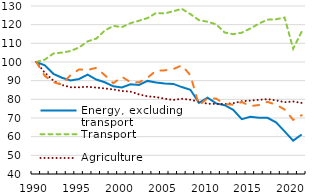
| Category | Energy, excluding transport | Transport | Agriculture | Industrial processes |
|---|---|---|---|---|
| 1990.0 | 100 | 100 | 100 | 100 |
| 1991.0 | 98.176 | 101.285 | 94.241 | 92.494 |
| 1992.0 | 93.669 | 104.553 | 89.969 | 89.17 |
| 1993.0 | 91.549 | 105.047 | 87.672 | 87.891 |
| 1994.0 | 90.108 | 105.857 | 86.494 | 93.046 |
| 1995.0 | 90.928 | 107.787 | 86.455 | 96.011 |
| 1996.0 | 93.219 | 111.061 | 86.714 | 95.743 |
| 1997.0 | 90.594 | 112.519 | 86.295 | 96.876 |
| 1998.0 | 89.133 | 116.837 | 85.851 | 92.936 |
| 1999.0 | 86.948 | 119.34 | 85.304 | 88.624 |
| 2000.0 | 86.38 | 118.707 | 84.456 | 92.082 |
| 2001.0 | 88.054 | 120.806 | 84.14 | 89.188 |
| 2002.0 | 87.666 | 122.113 | 82.646 | 89.089 |
| 2003.0 | 89.871 | 123.527 | 81.576 | 91.613 |
| 2004.0 | 89.041 | 126.264 | 81.237 | 95.404 |
| 2005.0 | 88.518 | 126.01 | 80.317 | 95.519 |
| 2006.0 | 88.249 | 127.216 | 79.669 | 96.196 |
| 2007.0 | 86.567 | 128.479 | 80.287 | 98.228 |
| 2008.0 | 85.112 | 125.644 | 79.771 | 92.886 |
| 2009.0 | 78.133 | 122.402 | 78.732 | 76.853 |
| 2010.0 | 80.913 | 121.586 | 77.643 | 80.528 |
| 2011.0 | 77.803 | 120.189 | 77.529 | 80.388 |
| 2012.0 | 76.867 | 115.797 | 77.493 | 77.535 |
| 2013.0 | 74.408 | 114.906 | 77.942 | 77.068 |
| 2014.0 | 69.417 | 115.704 | 78.984 | 78.524 |
| 2015.0 | 70.693 | 117.958 | 79.297 | 76.427 |
| 2016.0 | 70.14 | 120.562 | 79.725 | 76.928 |
| 2017.0 | 70.1 | 122.678 | 80.098 | 78.639 |
| 2018.0 | 67.642 | 122.902 | 79.476 | 77.114 |
| 2019.0 | 62.814 | 123.831 | 78.465 | 74.559 |
| 2020.0 | 57.897 | 107.094 | 78.818 | 69 |
| 2021.0 | 61.167 | 116.302 | 78.09 | 71.498 |